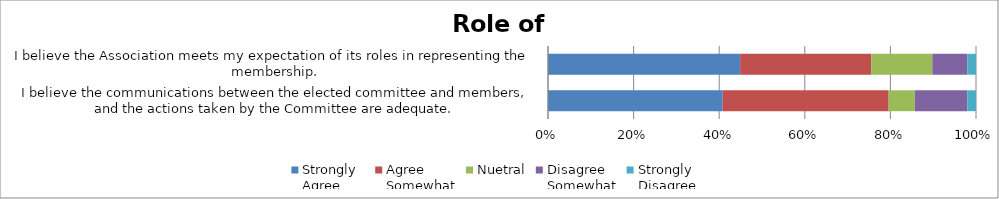
| Category | Strongly
Agree | Agree
Somewhat | Nuetral | Disagree
Somewhat | Strongly
Disagree |
|---|---|---|---|---|---|
| |I believe the communications between the elected committee and members, and the actions taken by the Committee are adequate. | 20 | 19 | 3 | 6 | 1 |
| [I believe the Association meets my expectation of its roles in representing the membership. | 22 | 15 | 7 | 4 | 1 |